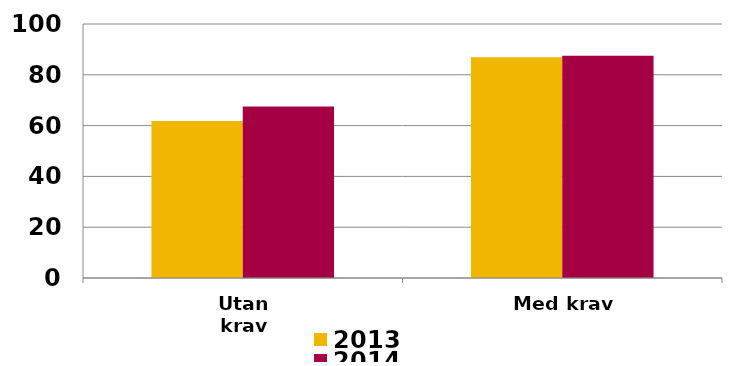
| Category | 2013 | 2014 |
|---|---|---|
| Utan krav | 61.811 | 67.527 |
| Med krav | 86.953 | 87.458 |